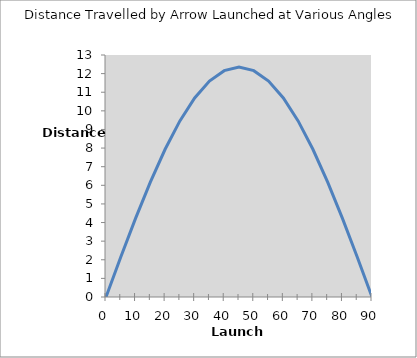
| Category | Series 0 |
|---|---|
| 0.0 | 0 |
| 5.0 | 2.144 |
| 10.0 | 4.223 |
| 15.0 | 6.173 |
| 20.0 | 7.936 |
| 25.0 | 9.458 |
| 30.0 | 10.693 |
| 35.0 | 11.602 |
| 40.0 | 12.159 |
| 45.0 | 12.347 |
| 50.0 | 12.159 |
| 55.0 | 11.602 |
| 60.0 | 10.693 |
| 65.0 | 9.458 |
| 70.0 | 7.936 |
| 75.0 | 6.173 |
| 80.0 | 4.223 |
| 85.0 | 2.144 |
| 90.0 | 0 |